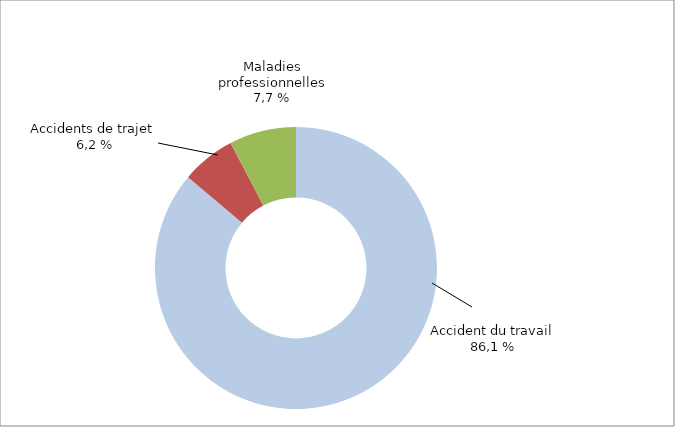
| Category | Series 0 |
|---|---|
| Accidents du travail | 46666 |
| Accidents de trajet | 3360 |
| Maladies professionnelles | 4159 |